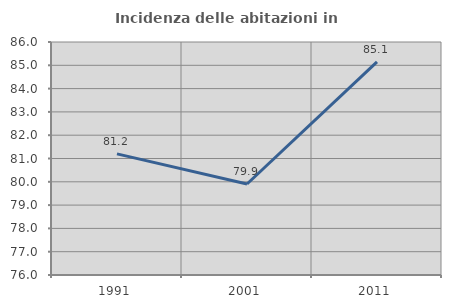
| Category | Incidenza delle abitazioni in proprietà  |
|---|---|
| 1991.0 | 81.2 |
| 2001.0 | 79.907 |
| 2011.0 | 85.149 |